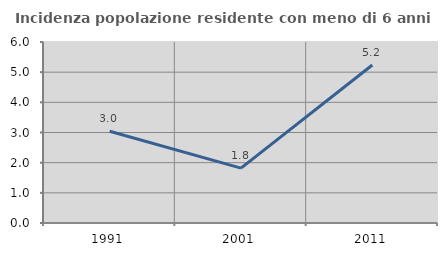
| Category | Incidenza popolazione residente con meno di 6 anni |
|---|---|
| 1991.0 | 3.042 |
| 2001.0 | 1.818 |
| 2011.0 | 5.238 |